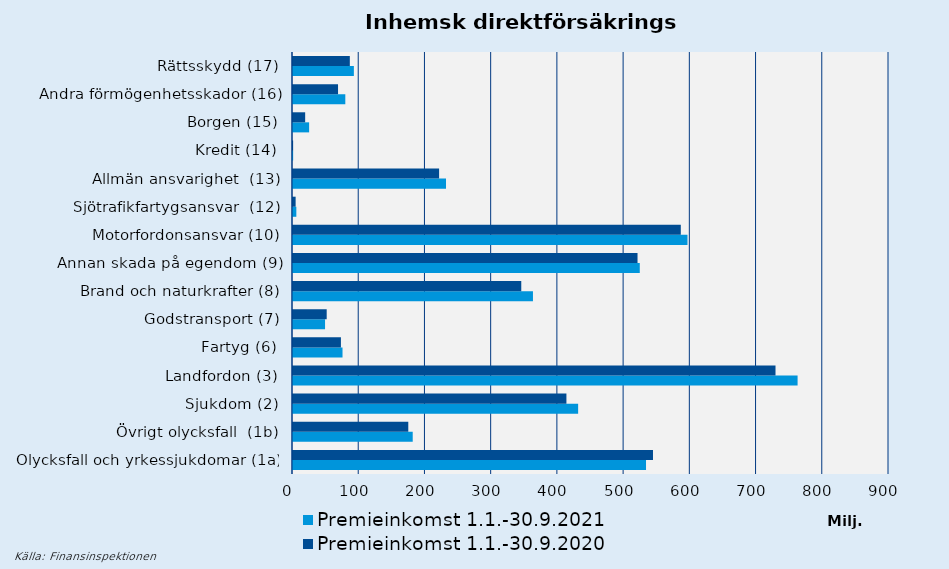
| Category | Premieinkomst |
|---|---|
| Olycksfall och yrkessjukdomar (1a) | 543609.656 |
| Övrigt olycksfall  (1b) | 174098.328 |
| Sjukdom (2) | 412880.783 |
| Landfordon (3) | 728620.489 |
| Fartyg (6) | 72357.856 |
| Godstransport (7) | 50876.686 |
| Brand och naturkrafter (8) | 344703.554 |
| Annan skada på egendom (9) | 520254.862 |
| Motorfordonsansvar (10) | 585601.942 |
| Sjötrafikfartygsansvar  (12) | 3972.229 |
| Allmän ansvarighet  (13) | 220617.779 |
| Kredit (14) | 188.491 |
| Borgen (15) | 18370.615 |
| Andra förmögenhetsskador (16) | 68006.41 |
| Rättsskydd (17) | 85810.009 |